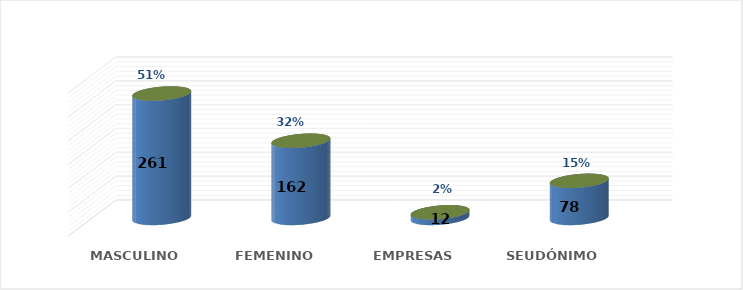
| Category | SOLICITUD POR GÉNERO | Series 1 |
|---|---|---|
| MASCULINO | 261 | 0.509 |
| FEMENINO | 162 | 0.316 |
| EMPRESAS | 12 | 0.023 |
| SEUDÓNIMO | 78 | 0.152 |